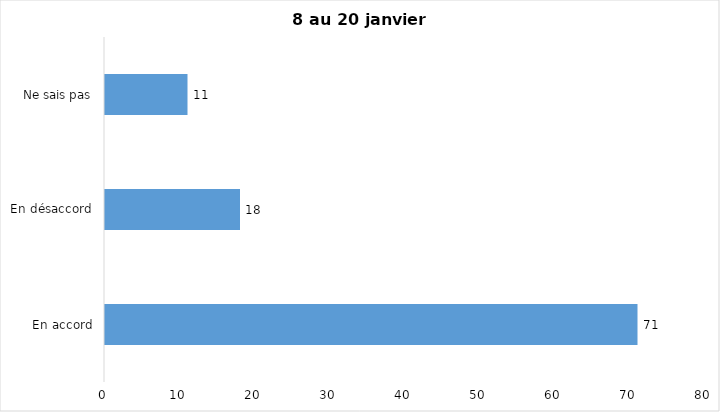
| Category | J’ai l’intention de recevoir le vaccin contre la COVID-19 lorsqu’il
sera disponible |
|---|---|
| En accord | 71 |
| En désaccord | 18 |
| Ne sais pas | 11 |